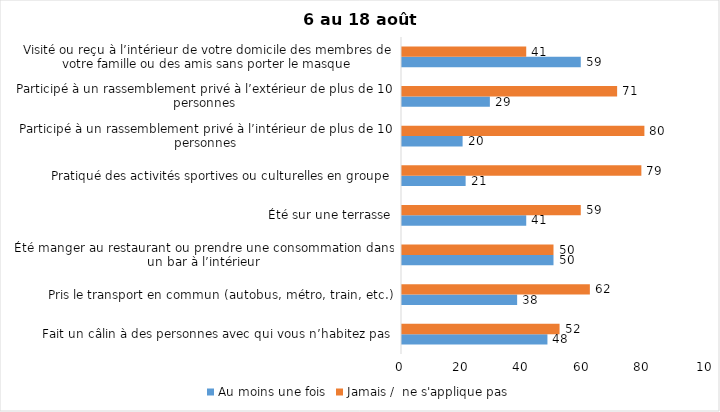
| Category | Au moins une fois | Jamais /  ne s'applique pas |
|---|---|---|
| Fait un câlin à des personnes avec qui vous n’habitez pas | 48 | 52 |
| Pris le transport en commun (autobus, métro, train, etc.) | 38 | 62 |
| Été manger au restaurant ou prendre une consommation dans un bar à l’intérieur | 50 | 50 |
| Été sur une terrasse | 41 | 59 |
| Pratiqué des activités sportives ou culturelles en groupe | 21 | 79 |
| Participé à un rassemblement privé à l’intérieur de plus de 10 personnes | 20 | 80 |
| Participé à un rassemblement privé à l’extérieur de plus de 10 personnes | 29 | 71 |
| Visité ou reçu à l’intérieur de votre domicile des membres de votre famille ou des amis sans porter le masque | 59 | 41 |